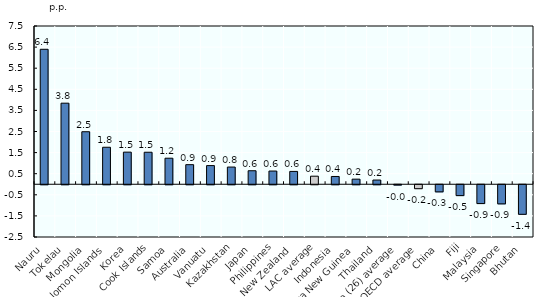
| Category | p.p. change |
|---|---|
| Nauru | 6.397 |
| Tokelau | 3.842 |
| Mongolia | 2.49 |
| Solomon Islands | 1.754 |
| Korea | 1.522 |
| Cook Islands | 1.517 |
| Samoa | 1.234 |
| Australia | 0.928 |
| Vanuatu | 0.884 |
| Kazakhstan | 0.815 |
| Japan | 0.64 |
| Philippines | 0.626 |
| New Zealand | 0.609 |
| LAC average | 0.382 |
| Indonesia | 0.369 |
| Papua New Guinea | 0.242 |
| Thailand | 0.2 |
| Africa (26) average | -0.016 |
| OECD average | -0.187 |
| China | -0.337 |
| Fiji | -0.515 |
| Malaysia | -0.892 |
| Singapore | -0.906 |
| Bhutan | -1.402 |